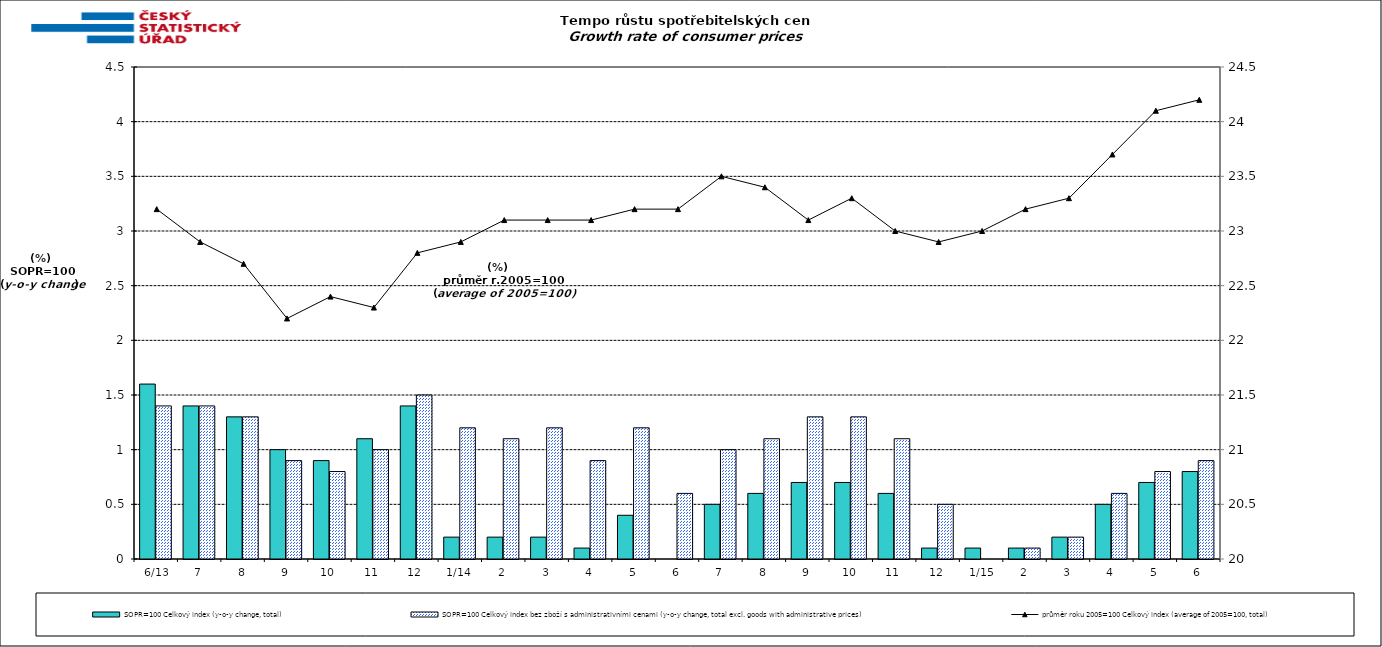
| Category | SOPR=100 Celkový index (y-o-y change, total) | SOPR=100 Celkový index bez zboží s administrativními cenami (y-o-y change, total excl. goods with administrative prices)  |
|---|---|---|
|  6/13 | 1.6 | 1.4 |
| 7 | 1.4 | 1.4 |
| 8 | 1.3 | 1.3 |
| 9 | 1 | 0.9 |
| 10 | 0.9 | 0.8 |
| 11 | 1.1 | 1 |
| 12 | 1.4 | 1.5 |
| 1/14 | 0.2 | 1.2 |
| 2 | 0.2 | 1.1 |
| 3 | 0.2 | 1.2 |
| 4 | 0.1 | 0.9 |
| 5 | 0.4 | 1.2 |
| 6 | 0 | 0.6 |
| 7 | 0.5 | 1 |
| 8 | 0.6 | 1.1 |
| 9 | 0.7 | 1.3 |
| 10 | 0.7 | 1.3 |
| 11 | 0.6 | 1.1 |
| 12 | 0.1 | 0.5 |
|  1/15 | 0.1 | 0 |
| 2 | 0.1 | 0.1 |
| 3 | 0.2 | 0.2 |
| 4 | 0.5 | 0.6 |
| 5 | 0.7 | 0.8 |
| 6 | 0.8 | 0.9 |